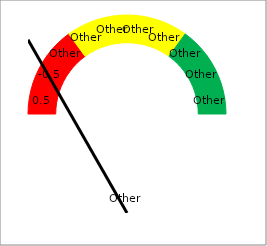
| Category | Series 0 |
|---|---|
| 0 | 0 |
|  | 1 |
|  | 0 |
|  | 1 |
|  | 0 |
|  | 1 |
| 3 | 0 |
|  | 1 |
|  | 0 |
|  | 1 |
| 5 | 0 |
|  | 1 |
|  | 0 |
|  | 1 |
| 7 | 0 |
|  | 1 |
|  | 0 |
|  | 1 |
|  | 0 |
|  | 1 |
| 10 | 0 |